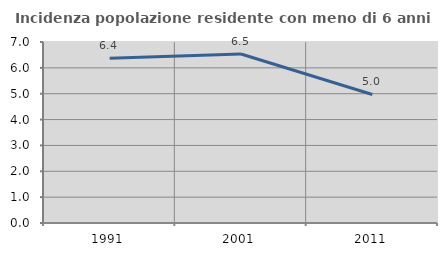
| Category | Incidenza popolazione residente con meno di 6 anni |
|---|---|
| 1991.0 | 6.369 |
| 2001.0 | 6.534 |
| 2011.0 | 4.971 |